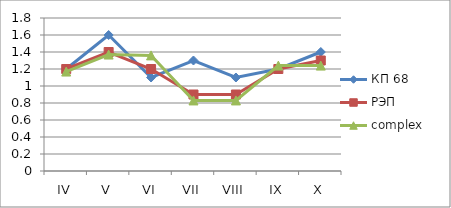
| Category | КП 68 | РЭП  | complex |
|---|---|---|---|
| IV | 1.2 | 1.2 | 1.17 |
| V | 1.6 | 1.4 | 1.37 |
| VI | 1.1 | 1.2 | 1.36 |
| VII | 1.3 | 0.9 | 0.83 |
| VIII | 1.1 | 0.9 | 0.83 |
| IX | 1.2 | 1.2 | 1.24 |
| X | 1.4 | 1.3 | 1.24 |